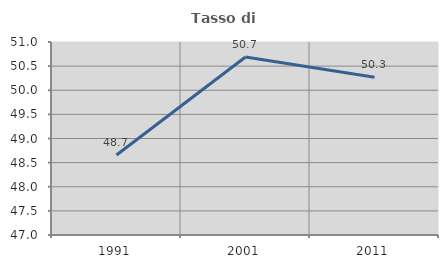
| Category | Tasso di occupazione   |
|---|---|
| 1991.0 | 48.657 |
| 2001.0 | 50.69 |
| 2011.0 | 50.271 |